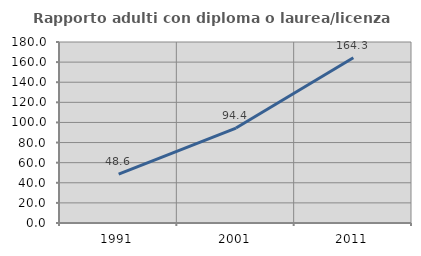
| Category | Rapporto adulti con diploma o laurea/licenza media  |
|---|---|
| 1991.0 | 48.627 |
| 2001.0 | 94.426 |
| 2011.0 | 164.336 |